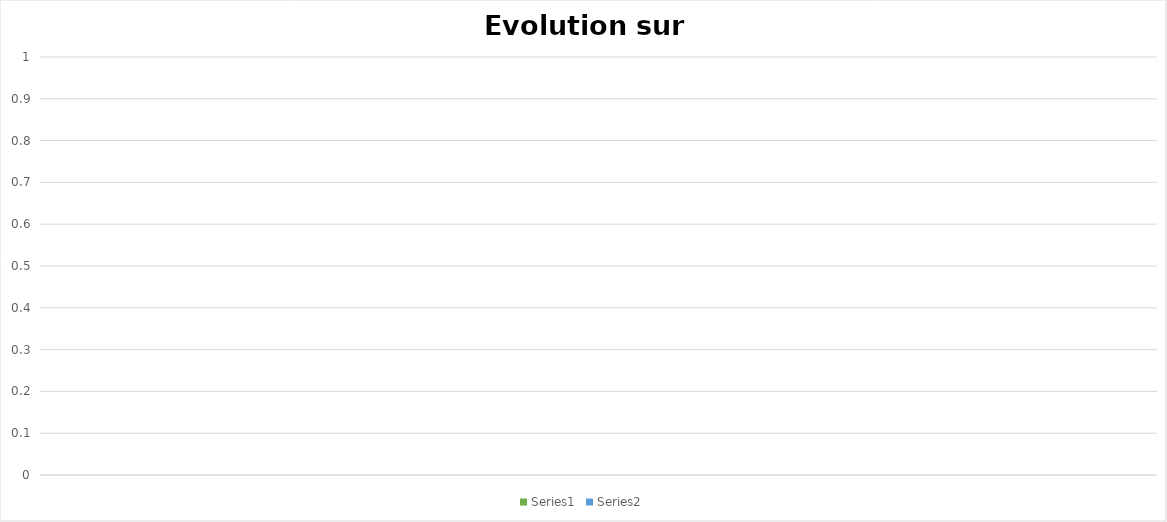
| Category | Series 0 | Series 1 |
|---|---|---|
|  | 0 | 0 |
|  | 0 | 0 |
|  | 0 | 0 |
|  | 0 | 0 |
|  | 0 | 0 |
|  | 0 | 0 |
|  | 0 | 0 |
|  | 0 | 0 |
|  | 0 | 0 |
|  | 0 | 0 |
|  | 0 | 0 |
|  | 0 | 0 |
|  | 0 | 0 |
|  | 0 | 0 |
|  | 0 | 0 |
|  | 0 | 0 |
|  | 0 | 0 |
|  | 0 | 0 |
|  | 0 | 0 |
|  | 0 | 0 |
|  | 0 | 0 |
|  | 0 | 0 |
|  | 0 | 0 |
|  | 0 | 0 |
|  | 0 | 0 |
|  | 0 | 0 |
|  | 0 | 0 |
|  | 0 | 0 |
|  | 0 | 0 |
|  | 0 | 0 |
|  | 0 | 0 |
|  | 0 | 0 |
|  | 0 | 0 |
|  | 0 | 0 |
|  | 0 | 0 |